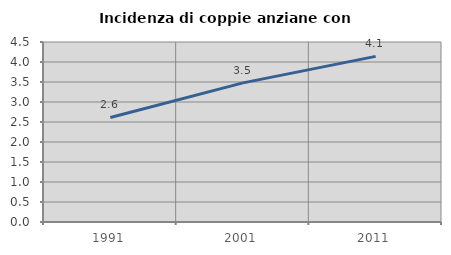
| Category | Incidenza di coppie anziane con figli |
|---|---|
| 1991.0 | 2.614 |
| 2001.0 | 3.478 |
| 2011.0 | 4.141 |